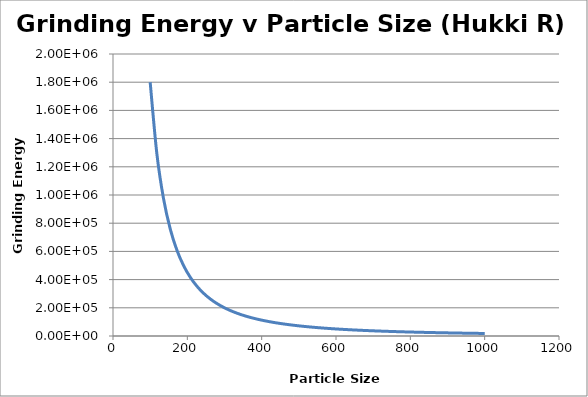
| Category | Series 0 |
|---|---|
| 1000.0 | 18000 |
| 981.9999999999999 | 18665.926 |
| 963.9999999999998 | 19369.501 |
| 945.9999999999998 | 20113.62 |
| 927.9999999999999 | 20901.457 |
| 909.9999999999999 | 21736.505 |
| 891.9999999999999 | 22622.615 |
| 873.9999999999999 | 23564.034 |
| 855.9999999999999 | 24565.464 |
| 838.0 | 25632.116 |
| 820.0 | 26769.78 |
| 802.0 | 27984.901 |
| 784.0 | 29284.673 |
| 766.0 | 30677.147 |
| 748.0000000000001 | 32171.352 |
| 730.0000000000001 | 33777.444 |
| 712.0000000000001 | 35506.88 |
| 694.0000000000001 | 37372.622 |
| 676.0000000000002 | 39389.377 |
| 658.0000000000002 | 41573.895 |
| 640.0000000000002 | 43945.312 |
| 622.0000000000002 | 46525.574 |
| 604.0000000000002 | 49339.941 |
| 586.0000000000003 | 52417.617 |
| 568.0000000000003 | 55792.501 |
| 550.0000000000003 | 59504.132 |
| 532.0000000000003 | 63598.847 |
| 514.0000000000003 | 68131.236 |
| 496.0000000000004 | 73165.973 |
| 478.00000000000045 | 78780.133 |
| 460.00000000000045 | 85066.163 |
| 442.0000000000005 | 92135.706 |
| 424.0000000000005 | 100124.6 |
| 406.0000000000005 | 109199.447 |
| 388.00000000000057 | 119566.373 |
| 370.00000000000057 | 131482.834 |
| 352.0000000000006 | 145273.76 |
| 334.0000000000006 | 161353.939 |
| 316.0000000000007 | 180259.574 |
| 298.0000000000007 | 202693.572 |
| 280.0000000000007 | 229591.837 |
| 262.00000000000074 | 262222.481 |
| 244.00000000000077 | 302338.081 |
| 226.00000000000074 | 352416.008 |
| 208.00000000000074 | 416050.296 |
| 190.00000000000074 | 498614.958 |
| 172.00000000000074 | 608436.993 |
| 154.00000000000074 | 758981.278 |
| 136.00000000000074 | 973183.391 |
| 118.00000000000074 | 1292731.974 |
| 100.00000000000074 | 1800000 |